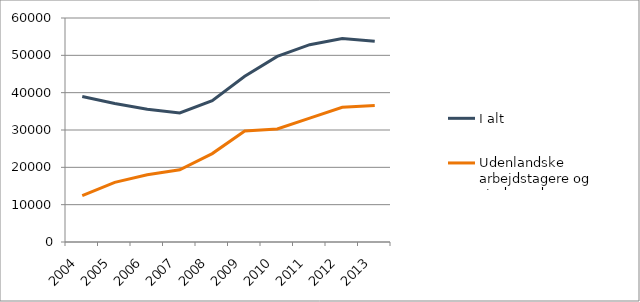
| Category | I alt  | Udenlandske arbejdstagere og studerende  |
|---|---|---|
| 2004.0 | 38954 | 12401 |
| 2005.0 | 37087 | 15985 |
| 2006.0 | 35568 | 18015 |
| 2007.0 | 34567 | 19356 |
| 2008.0 | 37834 | 23679 |
| 2009.0 | 44399 | 29717 |
| 2010.0 | 49707 | 30265 |
| 2011.0 | 52858 | 33196 |
| 2012.0 | 54479 | 36082 |
| 2013.0 | 53784 | 36549 |